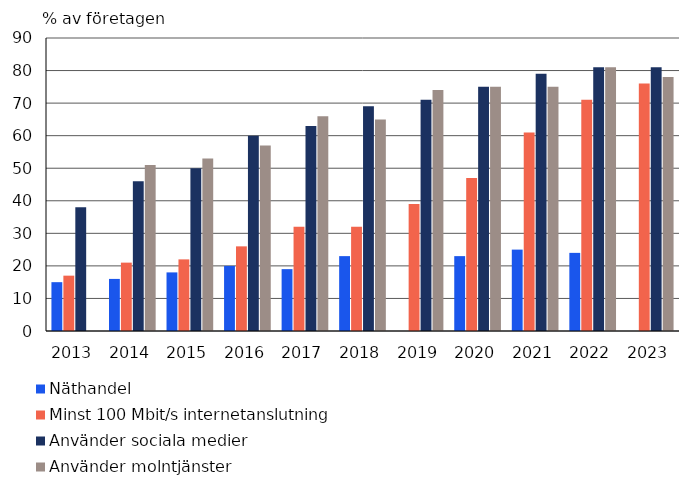
| Category | Näthandel | Minst 100 Mbit/s internetanslutning | Använder sociala medier | Använder molntjänster |
|---|---|---|---|---|
| 2013.0 | 15 | 17 | 38 | 0 |
| 2014.0 | 16 | 21 | 46 | 51 |
| 2015.0 | 18 | 22 | 50 | 53 |
| 2016.0 | 20 | 26 | 60 | 57 |
| 2017.0 | 19 | 32 | 63 | 66 |
| 2018.0 | 23 | 32 | 69 | 65 |
| 2019.0 | 0 | 39 | 71 | 74 |
| 2020.0 | 23 | 47 | 75 | 75 |
| 2021.0 | 25 | 61 | 79 | 75 |
| 2022.0 | 24 | 71 | 81 | 81 |
| 2023.0 | 0 | 76 | 81 | 78 |